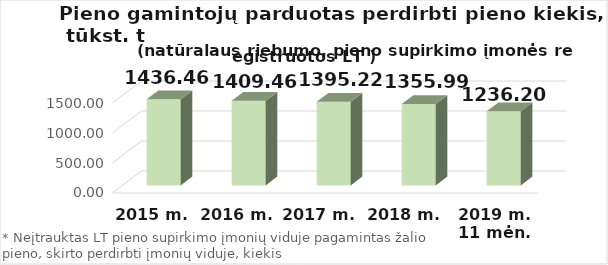
| Category | Lietuvos pieno supirkimo įmonėms* |
|---|---|
| 2015 m. | 1436.455 |
| 2016 m. | 1409.46 |
| 2017 m.  | 1395.224 |
| 2018 m.  | 1355.989 |
| 2019 m. 11 mėn. | 1236.2 |